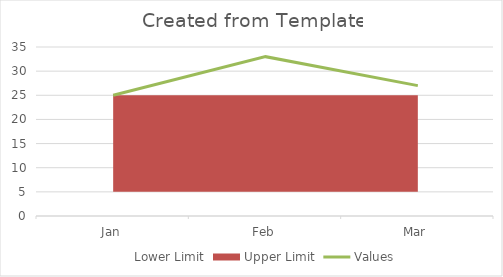
| Category | Values |
|---|---|
| Jan | 25 |
| Feb | 33 |
| Mar | 27 |